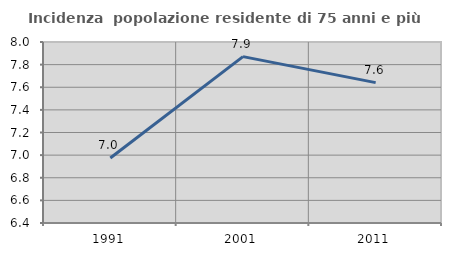
| Category | Incidenza  popolazione residente di 75 anni e più |
|---|---|
| 1991.0 | 6.975 |
| 2001.0 | 7.871 |
| 2011.0 | 7.641 |